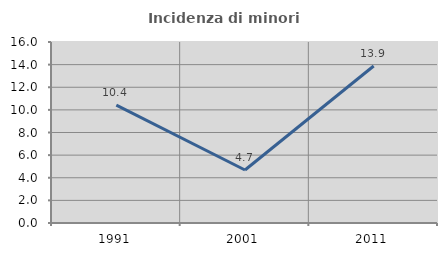
| Category | Incidenza di minori stranieri |
|---|---|
| 1991.0 | 10.417 |
| 2001.0 | 4.688 |
| 2011.0 | 13.879 |